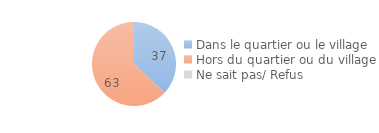
| Category | Series 0 |
|---|---|
| Dans le quartier ou le village | 37 |
| Hors du quartier ou du village | 63 |
| Ne sait pas/ Refus | 0 |